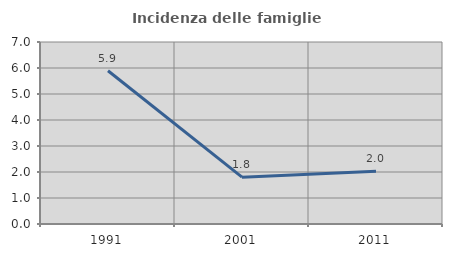
| Category | Incidenza delle famiglie numerose |
|---|---|
| 1991.0 | 5.894 |
| 2001.0 | 1.803 |
| 2011.0 | 2.028 |